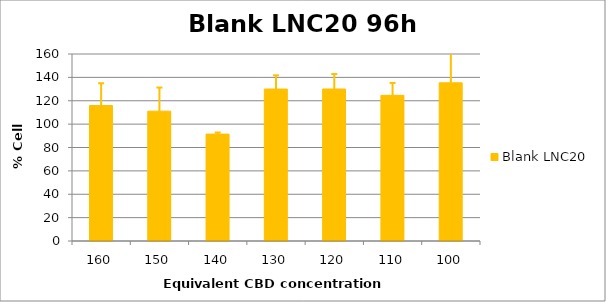
| Category | Blank LNC20 |
|---|---|
| 160.0 | 115.896 |
| 150.0 | 111.092 |
| 140.0 | 91.47 |
| 130.0 | 130.023 |
| 120.0 | 130.061 |
| 110.0 | 124.634 |
| 100.0 | 135.374 |